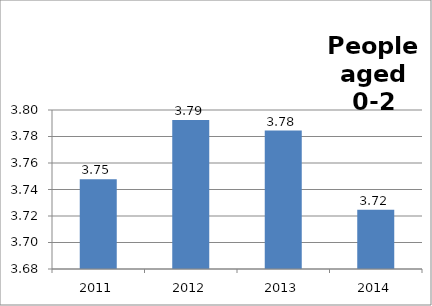
| Category | Series 0 |
|---|---|
| 2011 | 3.748 |
| 2012 | 3.792 |
| 2013 | 3.784 |
| 2014 | 3.725 |